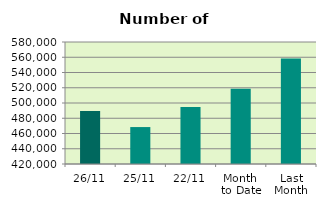
| Category | Series 0 |
|---|---|
| 26/11 | 489372 |
| 25/11 | 468444 |
| 22/11 | 494680 |
| Month 
to Date | 518545.444 |
| Last
Month | 558199.478 |